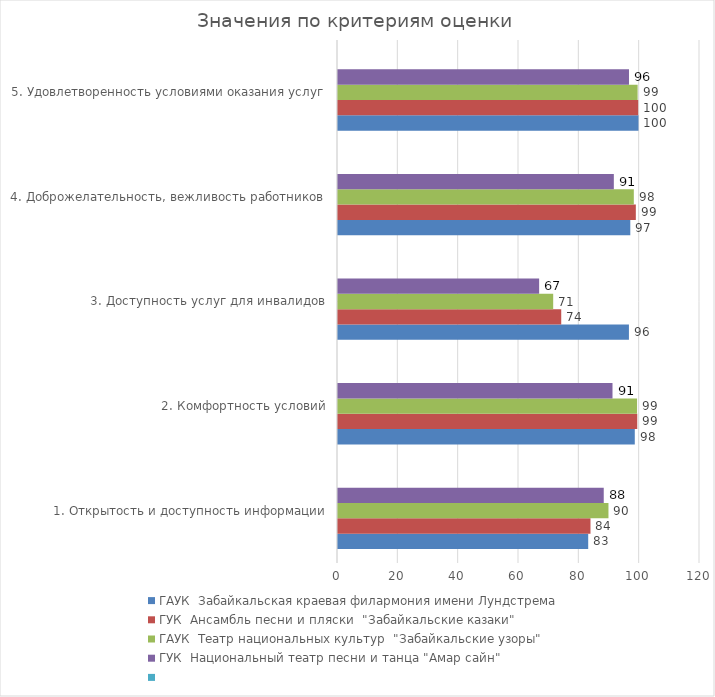
| Category | ГАУК  Забайкальская краевая филармония имени Лундстрема  | ГУК  Ансамбль песни и пляски  "Забайкальские казаки" | ГАУК  Театр национальных культур  "Забайкальские узоры" | ГУК  Национальный театр песни и танца "Амар сайн" | Series 4 |
|---|---|---|---|---|---|
| 1. Открытость и доступность информации | 82.941 | 83.696 | 89.656 | 88.092 |  |
| 2. Комфортность условий | 98.382 | 99.205 | 99.137 | 90.995 |  |
| 3. Доступность услуг для инвалидов | 96.441 | 74 | 71.333 | 66.677 |  |
| 4. Доброжелательность, вежливость работников | 96.893 | 98.728 | 98.061 | 91.438 |  |
| 5. Удовлетворенность условиями оказания услуг | 99.612 | 99.507 | 99.323 | 96.461 |  |